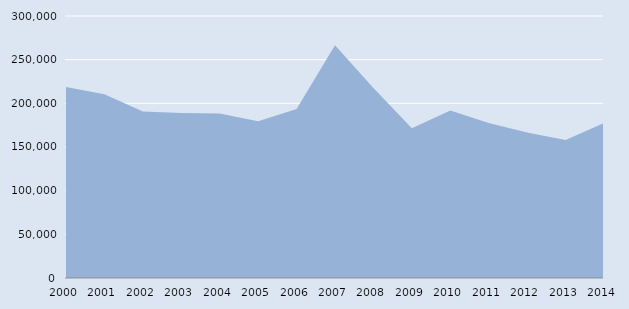
| Category | Series 0 |
|---|---|
| 2000.0 | 218646 |
| 2001.0 | 210269 |
| 2002.0 | 190736 |
| 2003.0 | 188874 |
| 2004.0 | 188277 |
| 2005.0 | 179463 |
| 2006.0 | 193621 |
| 2007.0 | 266612 |
| 2008.0 | 217540 |
| 2009.0 | 171506 |
| 2010.0 | 191803 |
| 2011.0 | 177561 |
| 2012.0 | 166582 |
| 2013.0 | 158002 |
| 2014.0 | 177431 |